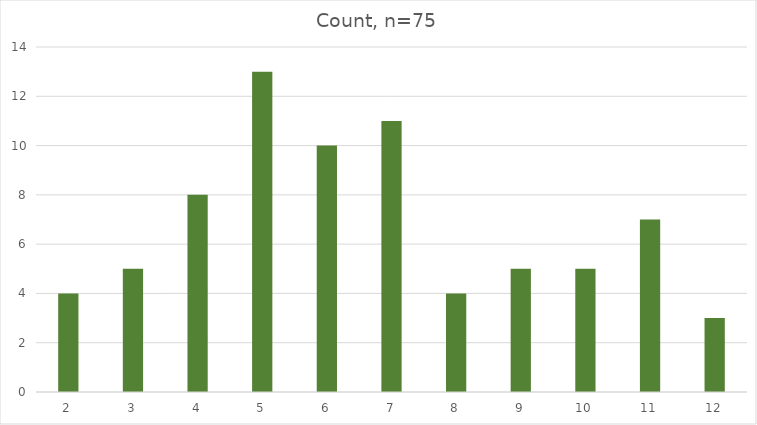
| Category | Count, n=75 |
|---|---|
| 2.0 | 4 |
| 3.0 | 5 |
| 4.0 | 8 |
| 5.0 | 13 |
| 6.0 | 10 |
| 7.0 | 11 |
| 8.0 | 4 |
| 9.0 | 5 |
| 10.0 | 5 |
| 11.0 | 7 |
| 12.0 | 3 |